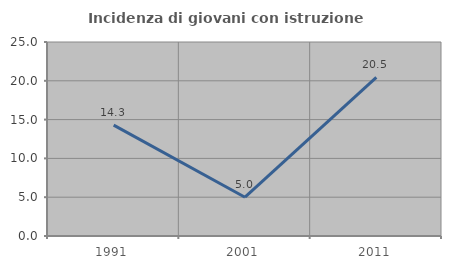
| Category | Incidenza di giovani con istruzione universitaria |
|---|---|
| 1991.0 | 14.286 |
| 2001.0 | 5 |
| 2011.0 | 20.455 |